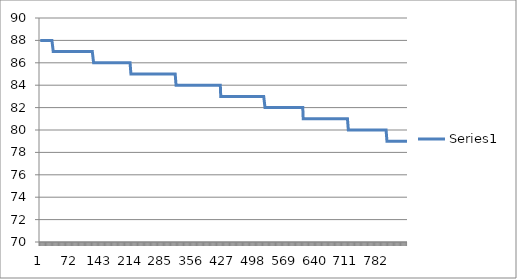
| Category | Series 0 |
|---|---|
| 0 | 88 |
| 1 | 88 |
| 2 | 88 |
| 3 | 88 |
| 4 | 88 |
| 5 | 88 |
| 6 | 88 |
| 7 | 88 |
| 8 | 88 |
| 9 | 88 |
| 10 | 88 |
| 11 | 88 |
| 12 | 88 |
| 13 | 88 |
| 14 | 88 |
| 15 | 88 |
| 16 | 88 |
| 17 | 88 |
| 18 | 88 |
| 19 | 88 |
| 20 | 88 |
| 21 | 88 |
| 22 | 88 |
| 23 | 88 |
| 24 | 88 |
| 25 | 88 |
| 26 | 88 |
| 27 | 88 |
| 28 | 88 |
| 29 | 88 |
| 30 | 87 |
| 31 | 87 |
| 32 | 87 |
| 33 | 87 |
| 34 | 87 |
| 35 | 87 |
| 36 | 87 |
| 37 | 87 |
| 38 | 87 |
| 39 | 87 |
| 40 | 87 |
| 41 | 87 |
| 42 | 87 |
| 43 | 87 |
| 44 | 87 |
| 45 | 87 |
| 46 | 87 |
| 47 | 87 |
| 48 | 87 |
| 49 | 87 |
| 50 | 87 |
| 51 | 87 |
| 52 | 87 |
| 53 | 87 |
| 54 | 87 |
| 55 | 87 |
| 56 | 87 |
| 57 | 87 |
| 58 | 87 |
| 59 | 87 |
| 60 | 87 |
| 61 | 87 |
| 62 | 87 |
| 63 | 87 |
| 64 | 87 |
| 65 | 87 |
| 66 | 87 |
| 67 | 87 |
| 68 | 87 |
| 69 | 87 |
| 70 | 87 |
| 71 | 87 |
| 72 | 87 |
| 73 | 87 |
| 74 | 87 |
| 75 | 87 |
| 76 | 87 |
| 77 | 87 |
| 78 | 87 |
| 79 | 87 |
| 80 | 87 |
| 81 | 87 |
| 82 | 87 |
| 83 | 87 |
| 84 | 87 |
| 85 | 87 |
| 86 | 87 |
| 87 | 87 |
| 88 | 87 |
| 89 | 87 |
| 90 | 87 |
| 91 | 87 |
| 92 | 87 |
| 93 | 87 |
| 94 | 87 |
| 95 | 87 |
| 96 | 87 |
| 97 | 87 |
| 98 | 87 |
| 99 | 87 |
| 100 | 87 |
| 101 | 87 |
| 102 | 87 |
| 103 | 87 |
| 104 | 87 |
| 105 | 87 |
| 106 | 87 |
| 107 | 87 |
| 108 | 87 |
| 109 | 87 |
| 110 | 87 |
| 111 | 87 |
| 112 | 87 |
| 113 | 87 |
| 114 | 87 |
| 115 | 87 |
| 116 | 87 |
| 117 | 87 |
| 118 | 87 |
| 119 | 87 |
| 120 | 87 |
| 121 | 87 |
| 122 | 87 |
| 123 | 86 |
| 124 | 86 |
| 125 | 86 |
| 126 | 86 |
| 127 | 86 |
| 128 | 86 |
| 129 | 86 |
| 130 | 86 |
| 131 | 86 |
| 132 | 86 |
| 133 | 86 |
| 134 | 86 |
| 135 | 86 |
| 136 | 86 |
| 137 | 86 |
| 138 | 86 |
| 139 | 86 |
| 140 | 86 |
| 141 | 86 |
| 142 | 86 |
| 143 | 86 |
| 144 | 86 |
| 145 | 86 |
| 146 | 86 |
| 147 | 86 |
| 148 | 86 |
| 149 | 86 |
| 150 | 86 |
| 151 | 86 |
| 152 | 86 |
| 153 | 86 |
| 154 | 86 |
| 155 | 86 |
| 156 | 86 |
| 157 | 86 |
| 158 | 86 |
| 159 | 86 |
| 160 | 86 |
| 161 | 86 |
| 162 | 86 |
| 163 | 86 |
| 164 | 86 |
| 165 | 86 |
| 166 | 86 |
| 167 | 86 |
| 168 | 86 |
| 169 | 86 |
| 170 | 86 |
| 171 | 86 |
| 172 | 86 |
| 173 | 86 |
| 174 | 86 |
| 175 | 86 |
| 176 | 86 |
| 177 | 86 |
| 178 | 86 |
| 179 | 86 |
| 180 | 86 |
| 181 | 86 |
| 182 | 86 |
| 183 | 86 |
| 184 | 86 |
| 185 | 86 |
| 186 | 86 |
| 187 | 86 |
| 188 | 86 |
| 189 | 86 |
| 190 | 86 |
| 191 | 86 |
| 192 | 86 |
| 193 | 86 |
| 194 | 86 |
| 195 | 86 |
| 196 | 86 |
| 197 | 86 |
| 198 | 86 |
| 199 | 86 |
| 200 | 86 |
| 201 | 86 |
| 202 | 86 |
| 203 | 86 |
| 204 | 86 |
| 205 | 86 |
| 206 | 86 |
| 207 | 86 |
| 208 | 86 |
| 209 | 85 |
| 210 | 85 |
| 211 | 85 |
| 212 | 85 |
| 213 | 85 |
| 214 | 85 |
| 215 | 85 |
| 216 | 85 |
| 217 | 85 |
| 218 | 85 |
| 219 | 85 |
| 220 | 85 |
| 221 | 85 |
| 222 | 85 |
| 223 | 85 |
| 224 | 85 |
| 225 | 85 |
| 226 | 85 |
| 227 | 85 |
| 228 | 85 |
| 229 | 85 |
| 230 | 85 |
| 231 | 85 |
| 232 | 85 |
| 233 | 85 |
| 234 | 85 |
| 235 | 85 |
| 236 | 85 |
| 237 | 85 |
| 238 | 85 |
| 239 | 85 |
| 240 | 85 |
| 241 | 85 |
| 242 | 85 |
| 243 | 85 |
| 244 | 85 |
| 245 | 85 |
| 246 | 85 |
| 247 | 85 |
| 248 | 85 |
| 249 | 85 |
| 250 | 85 |
| 251 | 85 |
| 252 | 85 |
| 253 | 85 |
| 254 | 85 |
| 255 | 85 |
| 256 | 85 |
| 257 | 85 |
| 258 | 85 |
| 259 | 85 |
| 260 | 85 |
| 261 | 85 |
| 262 | 85 |
| 263 | 85 |
| 264 | 85 |
| 265 | 85 |
| 266 | 85 |
| 267 | 85 |
| 268 | 85 |
| 269 | 85 |
| 270 | 85 |
| 271 | 85 |
| 272 | 85 |
| 273 | 85 |
| 274 | 85 |
| 275 | 85 |
| 276 | 85 |
| 277 | 85 |
| 278 | 85 |
| 279 | 85 |
| 280 | 85 |
| 281 | 85 |
| 282 | 85 |
| 283 | 85 |
| 284 | 85 |
| 285 | 85 |
| 286 | 85 |
| 287 | 85 |
| 288 | 85 |
| 289 | 85 |
| 290 | 85 |
| 291 | 85 |
| 292 | 85 |
| 293 | 85 |
| 294 | 85 |
| 295 | 85 |
| 296 | 85 |
| 297 | 85 |
| 298 | 85 |
| 299 | 85 |
| 300 | 85 |
| 301 | 85 |
| 302 | 85 |
| 303 | 85 |
| 304 | 85 |
| 305 | 85 |
| 306 | 85 |
| 307 | 85 |
| 308 | 85 |
| 309 | 85 |
| 310 | 85 |
| 311 | 85 |
| 312 | 85 |
| 313 | 84 |
| 314 | 84 |
| 315 | 84 |
| 316 | 84 |
| 317 | 84 |
| 318 | 84 |
| 319 | 84 |
| 320 | 84 |
| 321 | 84 |
| 322 | 84 |
| 323 | 84 |
| 324 | 84 |
| 325 | 84 |
| 326 | 84 |
| 327 | 84 |
| 328 | 84 |
| 329 | 84 |
| 330 | 84 |
| 331 | 84 |
| 332 | 84 |
| 333 | 84 |
| 334 | 84 |
| 335 | 84 |
| 336 | 84 |
| 337 | 84 |
| 338 | 84 |
| 339 | 84 |
| 340 | 84 |
| 341 | 84 |
| 342 | 84 |
| 343 | 84 |
| 344 | 84 |
| 345 | 84 |
| 346 | 84 |
| 347 | 84 |
| 348 | 84 |
| 349 | 84 |
| 350 | 84 |
| 351 | 84 |
| 352 | 84 |
| 353 | 84 |
| 354 | 84 |
| 355 | 84 |
| 356 | 84 |
| 357 | 84 |
| 358 | 84 |
| 359 | 84 |
| 360 | 84 |
| 361 | 84 |
| 362 | 84 |
| 363 | 84 |
| 364 | 84 |
| 365 | 84 |
| 366 | 84 |
| 367 | 84 |
| 368 | 84 |
| 369 | 84 |
| 370 | 84 |
| 371 | 84 |
| 372 | 84 |
| 373 | 84 |
| 374 | 84 |
| 375 | 84 |
| 376 | 84 |
| 377 | 84 |
| 378 | 84 |
| 379 | 84 |
| 380 | 84 |
| 381 | 84 |
| 382 | 84 |
| 383 | 84 |
| 384 | 84 |
| 385 | 84 |
| 386 | 84 |
| 387 | 84 |
| 388 | 84 |
| 389 | 84 |
| 390 | 84 |
| 391 | 84 |
| 392 | 84 |
| 393 | 84 |
| 394 | 84 |
| 395 | 84 |
| 396 | 84 |
| 397 | 84 |
| 398 | 84 |
| 399 | 84 |
| 400 | 84 |
| 401 | 84 |
| 402 | 84 |
| 403 | 84 |
| 404 | 84 |
| 405 | 84 |
| 406 | 84 |
| 407 | 84 |
| 408 | 84 |
| 409 | 84 |
| 410 | 84 |
| 411 | 84 |
| 412 | 84 |
| 413 | 84 |
| 414 | 84 |
| 415 | 84 |
| 416 | 83 |
| 417 | 83 |
| 418 | 83 |
| 419 | 83 |
| 420 | 83 |
| 421 | 83 |
| 422 | 83 |
| 423 | 83 |
| 424 | 83 |
| 425 | 83 |
| 426 | 83 |
| 427 | 83 |
| 428 | 83 |
| 429 | 83 |
| 430 | 83 |
| 431 | 83 |
| 432 | 83 |
| 433 | 83 |
| 434 | 83 |
| 435 | 83 |
| 436 | 83 |
| 437 | 83 |
| 438 | 83 |
| 439 | 83 |
| 440 | 83 |
| 441 | 83 |
| 442 | 83 |
| 443 | 83 |
| 444 | 83 |
| 445 | 83 |
| 446 | 83 |
| 447 | 83 |
| 448 | 83 |
| 449 | 83 |
| 450 | 83 |
| 451 | 83 |
| 452 | 83 |
| 453 | 83 |
| 454 | 83 |
| 455 | 83 |
| 456 | 83 |
| 457 | 83 |
| 458 | 83 |
| 459 | 83 |
| 460 | 83 |
| 461 | 83 |
| 462 | 83 |
| 463 | 83 |
| 464 | 83 |
| 465 | 83 |
| 466 | 83 |
| 467 | 83 |
| 468 | 83 |
| 469 | 83 |
| 470 | 83 |
| 471 | 83 |
| 472 | 83 |
| 473 | 83 |
| 474 | 83 |
| 475 | 83 |
| 476 | 83 |
| 477 | 83 |
| 478 | 83 |
| 479 | 83 |
| 480 | 83 |
| 481 | 83 |
| 482 | 83 |
| 483 | 83 |
| 484 | 83 |
| 485 | 83 |
| 486 | 83 |
| 487 | 83 |
| 488 | 83 |
| 489 | 83 |
| 490 | 83 |
| 491 | 83 |
| 492 | 83 |
| 493 | 83 |
| 494 | 83 |
| 495 | 83 |
| 496 | 83 |
| 497 | 83 |
| 498 | 83 |
| 499 | 83 |
| 500 | 83 |
| 501 | 83 |
| 502 | 83 |
| 503 | 83 |
| 504 | 83 |
| 505 | 83 |
| 506 | 83 |
| 507 | 83 |
| 508 | 83 |
| 509 | 83 |
| 510 | 83 |
| 511 | 83 |
| 512 | 83 |
| 513 | 83 |
| 514 | 83 |
| 515 | 83 |
| 516 | 83 |
| 517 | 83 |
| 518 | 82 |
| 519 | 82 |
| 520 | 82 |
| 521 | 82 |
| 522 | 82 |
| 523 | 82 |
| 524 | 82 |
| 525 | 82 |
| 526 | 82 |
| 527 | 82 |
| 528 | 82 |
| 529 | 82 |
| 530 | 82 |
| 531 | 82 |
| 532 | 82 |
| 533 | 82 |
| 534 | 82 |
| 535 | 82 |
| 536 | 82 |
| 537 | 82 |
| 538 | 82 |
| 539 | 82 |
| 540 | 82 |
| 541 | 82 |
| 542 | 82 |
| 543 | 82 |
| 544 | 82 |
| 545 | 82 |
| 546 | 82 |
| 547 | 82 |
| 548 | 82 |
| 549 | 82 |
| 550 | 82 |
| 551 | 82 |
| 552 | 82 |
| 553 | 82 |
| 554 | 82 |
| 555 | 82 |
| 556 | 82 |
| 557 | 82 |
| 558 | 82 |
| 559 | 82 |
| 560 | 82 |
| 561 | 82 |
| 562 | 82 |
| 563 | 82 |
| 564 | 82 |
| 565 | 82 |
| 566 | 82 |
| 567 | 82 |
| 568 | 82 |
| 569 | 82 |
| 570 | 82 |
| 571 | 82 |
| 572 | 82 |
| 573 | 82 |
| 574 | 82 |
| 575 | 82 |
| 576 | 82 |
| 577 | 82 |
| 578 | 82 |
| 579 | 82 |
| 580 | 82 |
| 581 | 82 |
| 582 | 82 |
| 583 | 82 |
| 584 | 82 |
| 585 | 82 |
| 586 | 82 |
| 587 | 82 |
| 588 | 82 |
| 589 | 82 |
| 590 | 82 |
| 591 | 82 |
| 592 | 82 |
| 593 | 82 |
| 594 | 82 |
| 595 | 82 |
| 596 | 82 |
| 597 | 82 |
| 598 | 82 |
| 599 | 82 |
| 600 | 82 |
| 601 | 82 |
| 602 | 82 |
| 603 | 82 |
| 604 | 82 |
| 605 | 82 |
| 606 | 81 |
| 607 | 81 |
| 608 | 81 |
| 609 | 81 |
| 610 | 81 |
| 611 | 81 |
| 612 | 81 |
| 613 | 81 |
| 614 | 81 |
| 615 | 81 |
| 616 | 81 |
| 617 | 81 |
| 618 | 81 |
| 619 | 81 |
| 620 | 81 |
| 621 | 81 |
| 622 | 81 |
| 623 | 81 |
| 624 | 81 |
| 625 | 81 |
| 626 | 81 |
| 627 | 81 |
| 628 | 81 |
| 629 | 81 |
| 630 | 81 |
| 631 | 81 |
| 632 | 81 |
| 633 | 81 |
| 634 | 81 |
| 635 | 81 |
| 636 | 81 |
| 637 | 81 |
| 638 | 81 |
| 639 | 81 |
| 640 | 81 |
| 641 | 81 |
| 642 | 81 |
| 643 | 81 |
| 644 | 81 |
| 645 | 81 |
| 646 | 81 |
| 647 | 81 |
| 648 | 81 |
| 649 | 81 |
| 650 | 81 |
| 651 | 81 |
| 652 | 81 |
| 653 | 81 |
| 654 | 81 |
| 655 | 81 |
| 656 | 81 |
| 657 | 81 |
| 658 | 81 |
| 659 | 81 |
| 660 | 81 |
| 661 | 81 |
| 662 | 81 |
| 663 | 81 |
| 664 | 81 |
| 665 | 81 |
| 666 | 81 |
| 667 | 81 |
| 668 | 81 |
| 669 | 81 |
| 670 | 81 |
| 671 | 81 |
| 672 | 81 |
| 673 | 81 |
| 674 | 81 |
| 675 | 81 |
| 676 | 81 |
| 677 | 81 |
| 678 | 81 |
| 679 | 81 |
| 680 | 81 |
| 681 | 81 |
| 682 | 81 |
| 683 | 81 |
| 684 | 81 |
| 685 | 81 |
| 686 | 81 |
| 687 | 81 |
| 688 | 81 |
| 689 | 81 |
| 690 | 81 |
| 691 | 81 |
| 692 | 81 |
| 693 | 81 |
| 694 | 81 |
| 695 | 81 |
| 696 | 81 |
| 697 | 81 |
| 698 | 81 |
| 699 | 81 |
| 700 | 81 |
| 701 | 81 |
| 702 | 81 |
| 703 | 81 |
| 704 | 81 |
| 705 | 81 |
| 706 | 81 |
| 707 | 81 |
| 708 | 81 |
| 709 | 81 |
| 710 | 80 |
| 711 | 80 |
| 712 | 80 |
| 713 | 80 |
| 714 | 80 |
| 715 | 80 |
| 716 | 80 |
| 717 | 80 |
| 718 | 80 |
| 719 | 80 |
| 720 | 80 |
| 721 | 80 |
| 722 | 80 |
| 723 | 80 |
| 724 | 80 |
| 725 | 80 |
| 726 | 80 |
| 727 | 80 |
| 728 | 80 |
| 729 | 80 |
| 730 | 80 |
| 731 | 80 |
| 732 | 80 |
| 733 | 80 |
| 734 | 80 |
| 735 | 80 |
| 736 | 80 |
| 737 | 80 |
| 738 | 80 |
| 739 | 80 |
| 740 | 80 |
| 741 | 80 |
| 742 | 80 |
| 743 | 80 |
| 744 | 80 |
| 745 | 80 |
| 746 | 80 |
| 747 | 80 |
| 748 | 80 |
| 749 | 80 |
| 750 | 80 |
| 751 | 80 |
| 752 | 80 |
| 753 | 80 |
| 754 | 80 |
| 755 | 80 |
| 756 | 80 |
| 757 | 80 |
| 758 | 80 |
| 759 | 80 |
| 760 | 80 |
| 761 | 80 |
| 762 | 80 |
| 763 | 80 |
| 764 | 80 |
| 765 | 80 |
| 766 | 80 |
| 767 | 80 |
| 768 | 80 |
| 769 | 80 |
| 770 | 80 |
| 771 | 80 |
| 772 | 80 |
| 773 | 80 |
| 774 | 80 |
| 775 | 80 |
| 776 | 80 |
| 777 | 80 |
| 778 | 80 |
| 779 | 80 |
| 780 | 80 |
| 781 | 80 |
| 782 | 80 |
| 783 | 80 |
| 784 | 80 |
| 785 | 80 |
| 786 | 80 |
| 787 | 80 |
| 788 | 80 |
| 789 | 80 |
| 790 | 80 |
| 791 | 80 |
| 792 | 80 |
| 793 | 80 |
| 794 | 80 |
| 795 | 80 |
| 796 | 80 |
| 797 | 80 |
| 798 | 80 |
| 799 | 79 |
| 800 | 79 |
| 801 | 79 |
| 802 | 79 |
| 803 | 79 |
| 804 | 79 |
| 805 | 79 |
| 806 | 79 |
| 807 | 79 |
| 808 | 79 |
| 809 | 79 |
| 810 | 79 |
| 811 | 79 |
| 812 | 79 |
| 813 | 79 |
| 814 | 79 |
| 815 | 79 |
| 816 | 79 |
| 817 | 79 |
| 818 | 79 |
| 819 | 79 |
| 820 | 79 |
| 821 | 79 |
| 822 | 79 |
| 823 | 79 |
| 824 | 79 |
| 825 | 79 |
| 826 | 79 |
| 827 | 79 |
| 828 | 79 |
| 829 | 79 |
| 830 | 79 |
| 831 | 79 |
| 832 | 79 |
| 833 | 79 |
| 834 | 79 |
| 835 | 79 |
| 836 | 79 |
| 837 | 79 |
| 838 | 79 |
| 839 | 79 |
| 840 | 79 |
| 841 | 79 |
| 842 | 79 |
| 843 | 79 |
| 844 | 79 |
| 845 | 79 |
| 846 | 79 |
| 847 | 79 |